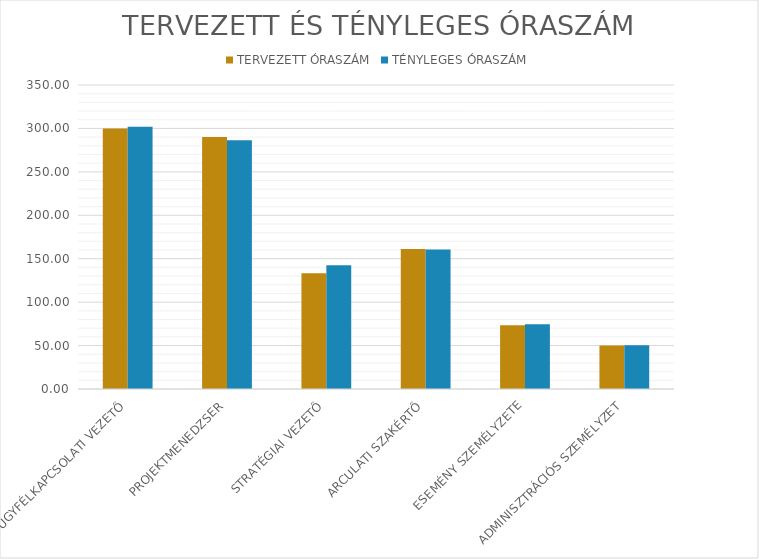
| Category | TERVEZETT ÓRASZÁM | TÉNYLEGES ÓRASZÁM |
|---|---|---|
| ÜGYFÉLKAPCSOLATI VEZETŐ | 300 | 302 |
| PROJEKTMENEDZSER | 290 | 286.333 |
| STRATÉGIAI VEZETŐ | 133.333 | 142.5 |
| ARCULATI SZAKÉRTŐ | 161.111 | 160.556 |
| ESEMÉNY SZEMÉLYZETE | 73.333 | 74.444 |
| ADMINISZTRÁCIÓS SZEMÉLYZET | 50 | 50.333 |